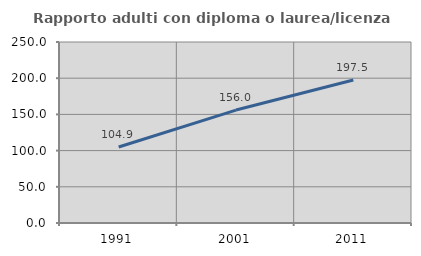
| Category | Rapporto adulti con diploma o laurea/licenza media  |
|---|---|
| 1991.0 | 104.921 |
| 2001.0 | 155.98 |
| 2011.0 | 197.484 |